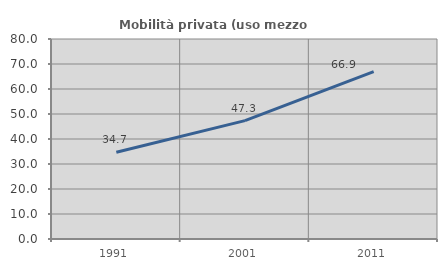
| Category | Mobilità privata (uso mezzo privato) |
|---|---|
| 1991.0 | 34.731 |
| 2001.0 | 47.347 |
| 2011.0 | 66.948 |